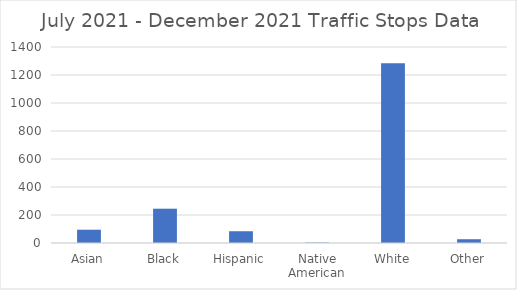
| Category | Series 0 |
|---|---|
| Asian | 95 |
| Black | 245 |
| Hispanic | 84 |
| Native American | 3 |
| White | 1284 |
| Other | 27 |